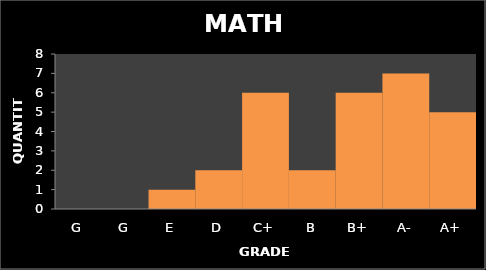
| Category | Quantity |
|---|---|
| G | 0 |
| G | 0 |
| E | 1 |
| D | 2 |
| C+ | 6 |
| B | 2 |
| B+ | 6 |
| A- | 7 |
| A+ | 5 |